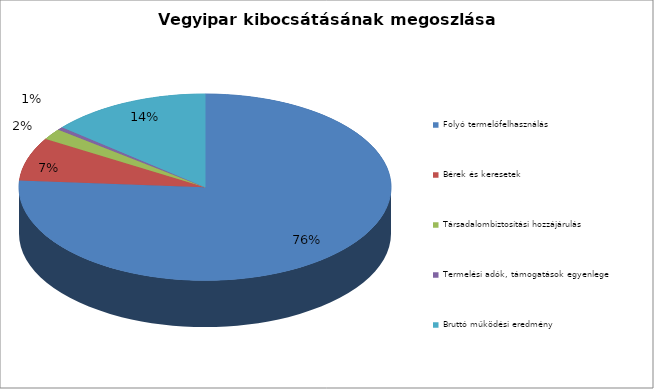
| Category | Series 0 |
|---|---|
| Folyó termelőfelhasználás | 4418895 |
| Bérek és keresetek | 434934 |
| Társadalombiztosítási hozzájárulás | 111441 |
| Termelési adók, támogatások egyenlege | 30973 |
| Bruttó működési eredmény | 808164 |